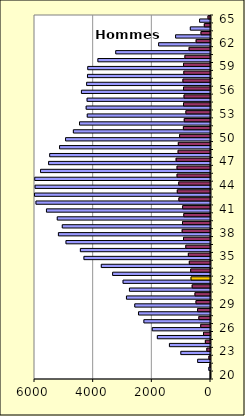
| Category | Hommes |
|---|---|
| 20 | 3 |
| 21 | 19 |
| 22 | 55 |
| 23 | 124 |
| 24 | 175 |
| 25 | 238 |
| 26 | 333 |
| 27 | 397 |
| 28 | 440 |
| 29 | 495 |
| 30 | 530 |
| 31 | 625 |
| 32 | 665 |
| 33 | 675 |
| 34 | 722 |
| 35 | 755 |
| 36 | 842 |
| 37 | 919 |
| 38 | 966 |
| 39 | 955 |
| 40 | 911 |
| 41 | 950 |
| 42 | 1078 |
| 43 | 1132 |
| 44 | 1083 |
| 45 | 1140 |
| 46 | 1141 |
| 47 | 1172 |
| 48 | 1105 |
| 49 | 1097 |
| 50 | 1054 |
| 51 | 924 |
| 52 | 895 |
| 53 | 839 |
| 54 | 920 |
| 55 | 903 |
| 56 | 919 |
| 57 | 940 |
| 58 | 909 |
| 59 | 919 |
| 60 | 872 |
| 61 | 730 |
| 62 | 490 |
| 63 | 324 |
| 64 | 211 |
| 65 | 86 |